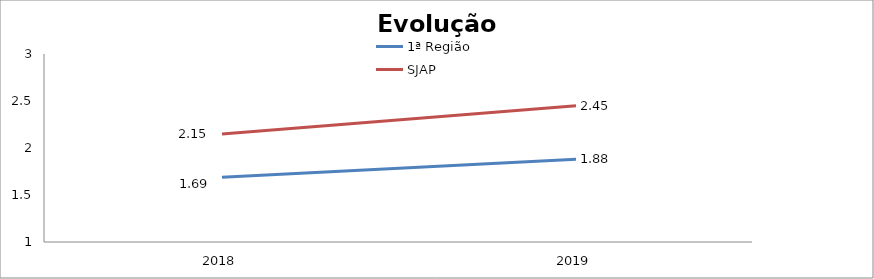
| Category | 1ª Região | SJAP |
|---|---|---|
| 0 | 1.69 | 2.15 |
| 1 | 1.88 | 2.45 |